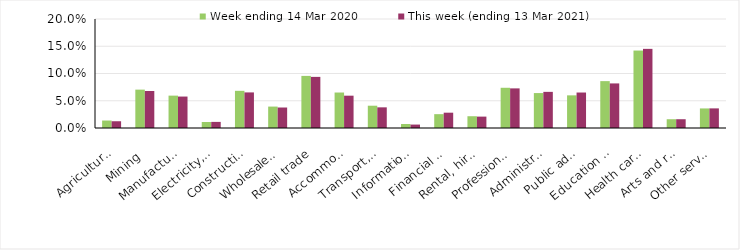
| Category | Week ending 14 Mar 2020 | This week (ending 13 Mar 2021) |
|---|---|---|
| Agriculture, forestry and fishing | 0.014 | 0.012 |
| Mining | 0.07 | 0.068 |
| Manufacturing | 0.059 | 0.058 |
| Electricity, gas, water and waste services | 0.011 | 0.011 |
| Construction | 0.068 | 0.065 |
| Wholesale trade | 0.039 | 0.038 |
| Retail trade | 0.096 | 0.094 |
| Accommodation and food services | 0.065 | 0.059 |
| Transport, postal and warehousing | 0.041 | 0.038 |
| Information media and telecommunications | 0.007 | 0.006 |
| Financial and insurance services | 0.025 | 0.028 |
| Rental, hiring and real estate services | 0.022 | 0.021 |
| Professional, scientific and technical services | 0.074 | 0.073 |
| Administrative and support services | 0.064 | 0.066 |
| Public administration and safety | 0.06 | 0.065 |
| Education and training | 0.086 | 0.082 |
| Health care and social assistance | 0.142 | 0.145 |
| Arts and recreation services | 0.016 | 0.016 |
| Other services | 0.036 | 0.036 |